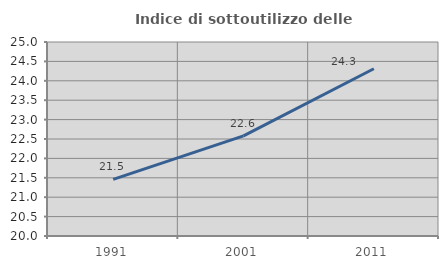
| Category | Indice di sottoutilizzo delle abitazioni  |
|---|---|
| 1991.0 | 21.461 |
| 2001.0 | 22.581 |
| 2011.0 | 24.31 |